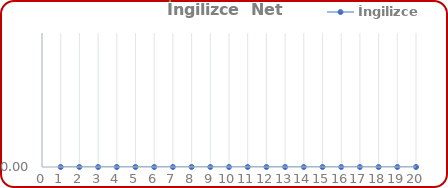
| Category | İngilizce |
|---|---|
| 0 | 0 |
| 1 | 0 |
| 2 | 0 |
| 3 | 0 |
| 4 | 0 |
| 5 | 0 |
| 6 | 0 |
| 7 | 0 |
| 8 | 0 |
| 9 | 0 |
| 10 | 0 |
| 11 | 0 |
| 12 | 0 |
| 13 | 0 |
| 14 | 0 |
| 15 | 0 |
| 16 | 0 |
| 17 | 0 |
| 18 | 0 |
| 19 | 0 |